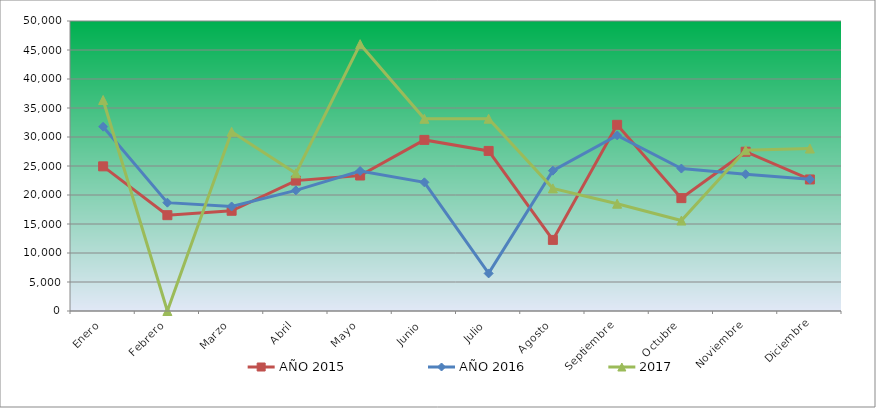
| Category | AÑO 2015 | AÑO 2016 | 2017 |
|---|---|---|---|
| Enero | 24940 | 31780 | 36380 |
| Febrero | 16520 | 18680 | 0 |
| Marzo | 17280 | 18020 | 30900 |
| Abril | 22480 | 20800 | 23740 |
| Mayo | 23360 | 24140 | 46000 |
| Junio | 29500 | 22180 | 33140 |
| Julio | 27600 | 6480 | 33150 |
| Agosto | 12260 | 24200 | 21140 |
| Septiembre | 32100 | 30280 | 18500 |
| Octubre | 19460 | 24560 | 15600 |
| Noviembre | 27460 | 23580 | 27720 |
| Diciembre | 22680 | 22710 | 28010 |